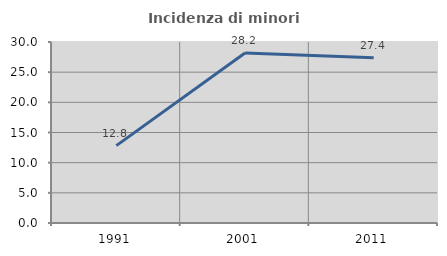
| Category | Incidenza di minori stranieri |
|---|---|
| 1991.0 | 12.821 |
| 2001.0 | 28.191 |
| 2011.0 | 27.403 |